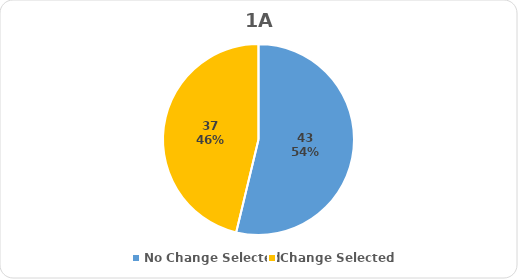
| Category | Series 0 |
|---|---|
| No Change Selected | 43 |
| Change Selected | 37 |